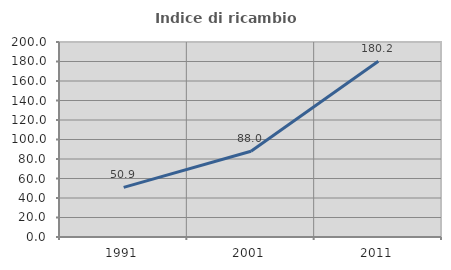
| Category | Indice di ricambio occupazionale  |
|---|---|
| 1991.0 | 50.928 |
| 2001.0 | 87.97 |
| 2011.0 | 180.223 |